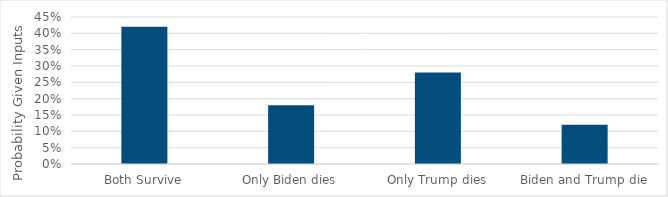
| Category | Series 0 |
|---|---|
| Both Survive | 0.42 |
| Only Biden dies | 0.18 |
| Only Trump dies | 0.28 |
| Biden and Trump die | 0.12 |